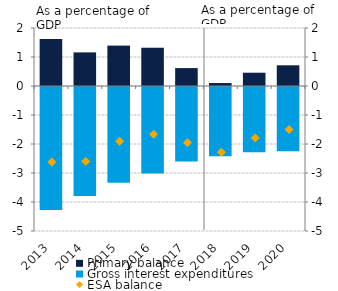
| Category | Primary balance | Gross interest expenditures |
|---|---|---|
| 2013.0 | 1.618 | -4.238 |
| 2014.0 | 1.159 | -3.758 |
| 2015.0 | 1.392 | -3.298 |
| 2016.0 | 1.319 | -2.984 |
| 2017.0 | 0.618 | -2.573 |
| 2018.0 | 0.102 | -2.388 |
| 2019.0 | 0.458 | -2.247 |
| 2020.0 | 0.714 | -2.214 |